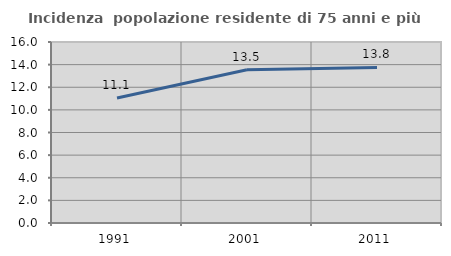
| Category | Incidenza  popolazione residente di 75 anni e più |
|---|---|
| 1991.0 | 11.054 |
| 2001.0 | 13.548 |
| 2011.0 | 13.753 |